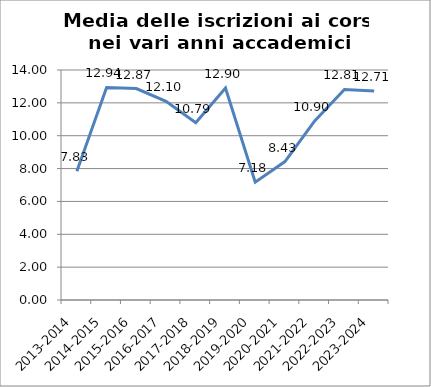
| Category | Media delle iscrizioni ai Corsi |
|---|---|
| 2013-2014 | 7.833 |
| 2014-2015 | 12.935 |
| 2015-2016 | 12.87 |
| 2016-2017 | 12.098 |
| 2017-2018 | 10.787 |
| 2018-2019 | 12.905 |
| 2019-2020 | 7.175 |
| 2020-2021 | 8.426 |
| 2021-2022 | 10.903 |
| 2022-2023 | 12.813 |
| 2023-2024 | 12.714 |